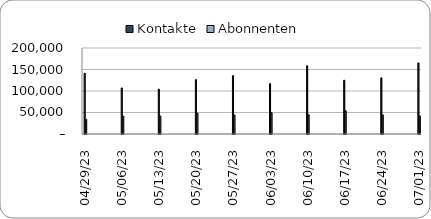
| Category | Kontakte | Abonnenten |
|---|---|---|
| 2023-07-01 | 165293.313 | 42133.59 |
| 2023-06-24 | 130544.362 | 44430.888 |
| 2023-06-17 | 125068.671 | 53924.536 |
| 2023-06-10 | 158697.069 | 44829.68 |
| 2023-06-03 | 117083.517 | 49671.795 |
| 2023-05-27 | 135574.03 | 43875.091 |
| 2023-05-20 | 126309.846 | 48614.099 |
| 2023-05-13 | 104346.211 | 41652.603 |
| 2023-05-06 | 107052.581 | 41631.559 |
| 2023-04-29 | 141208.9 | 34041.431 |